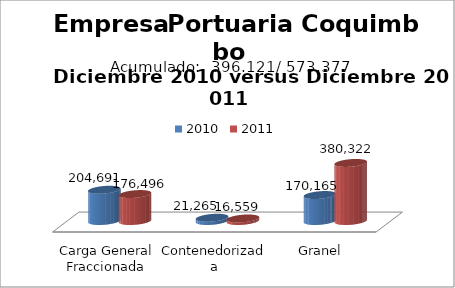
| Category | 2010 | 2011 |
|---|---|---|
| Carga General Fraccionada | 204691 | 176496 |
| Contenedorizada | 21265 | 16559 |
| Granel | 170165 | 380322 |